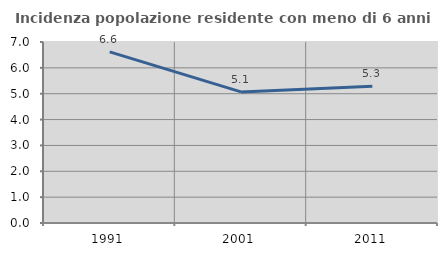
| Category | Incidenza popolazione residente con meno di 6 anni |
|---|---|
| 1991.0 | 6.62 |
| 2001.0 | 5.071 |
| 2011.0 | 5.29 |